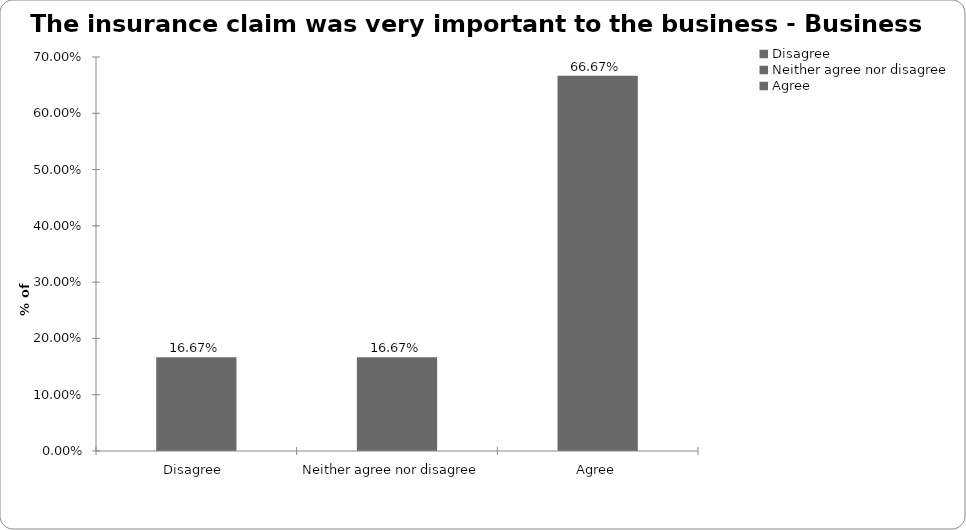
| Category | Business Interruption |
|---|---|
| Disagree  | 0.167 |
| Neither agree nor disagree  | 0.167 |
| Agree | 0.667 |